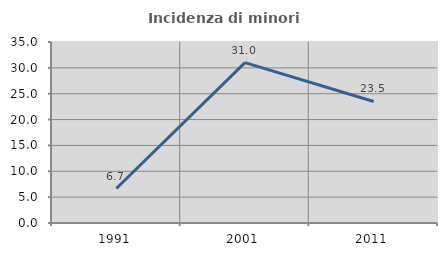
| Category | Incidenza di minori stranieri |
|---|---|
| 1991.0 | 6.667 |
| 2001.0 | 31 |
| 2011.0 | 23.497 |